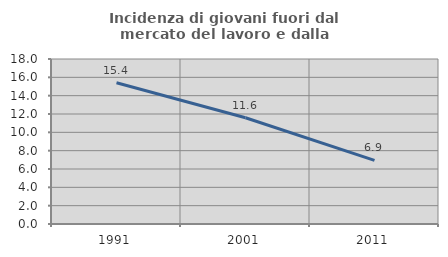
| Category | Incidenza di giovani fuori dal mercato del lavoro e dalla formazione  |
|---|---|
| 1991.0 | 15.415 |
| 2001.0 | 11.588 |
| 2011.0 | 6.944 |